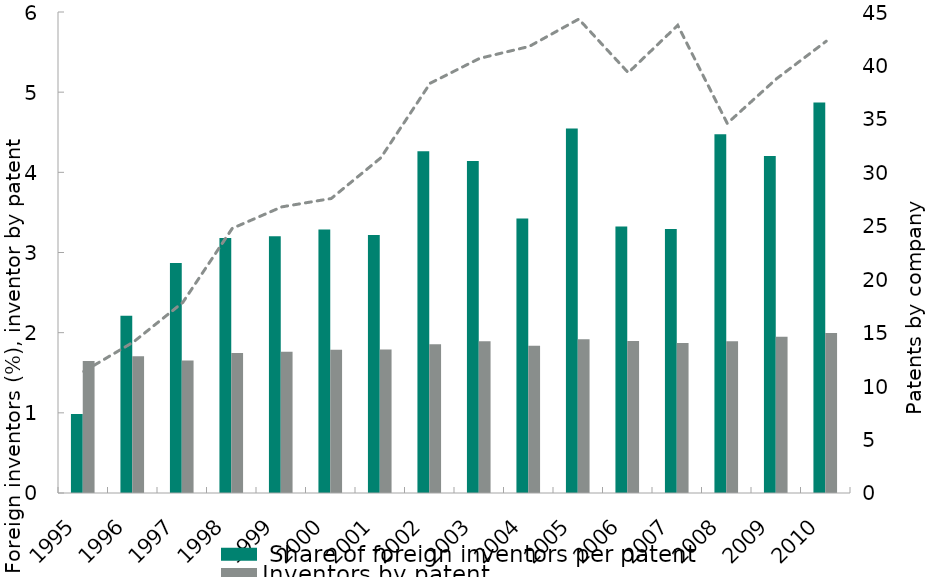
| Category |  Share of foreign inventors per patent | Inventors by patent |
|---|---|---|
| 1995.0 | 0.985 | 1.648 |
| 1996.0 | 2.21 | 1.706 |
| 1997.0 | 2.867 | 1.651 |
| 1998.0 | 3.18 | 1.748 |
| 1999.0 | 3.202 | 1.761 |
| 2000.0 | 3.288 | 1.788 |
| 2001.0 | 3.22 | 1.789 |
| 2002.0 | 4.262 | 1.854 |
| 2003.0 | 4.142 | 1.892 |
| 2004.0 | 3.423 | 1.836 |
| 2005.0 | 4.548 | 1.919 |
| 2006.0 | 3.325 | 1.898 |
| 2007.0 | 3.293 | 1.87 |
| 2008.0 | 4.474 | 1.892 |
| 2009.0 | 4.203 | 1.948 |
| 2010.0 | 4.87 | 1.995 |